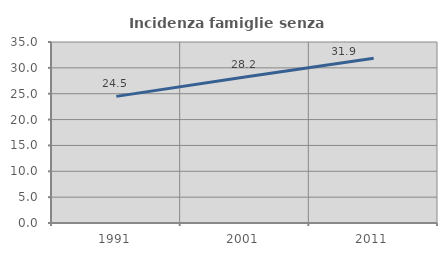
| Category | Incidenza famiglie senza nuclei |
|---|---|
| 1991.0 | 24.487 |
| 2001.0 | 28.219 |
| 2011.0 | 31.856 |